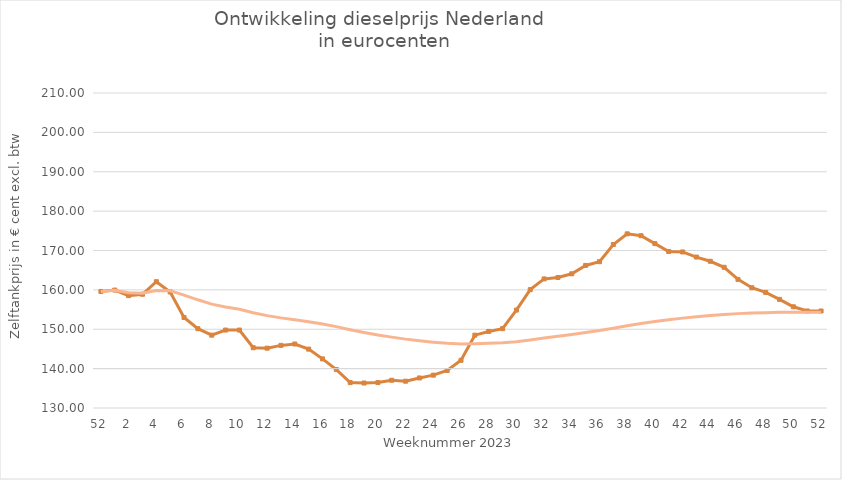
| Category | 52 |
|---|---|
| 52.0 | 159.6 |
| 1.0 | 159.908 |
| 2.0 | 159.266 |
| 3.0 | 159.145 |
| 4.0 | 159.852 |
| 5.0 | 159.779 |
| 6.0 | 158.673 |
| 7.0 | 157.479 |
| 8.0 | 156.376 |
| 9.0 | 155.657 |
| 10.0 | 155.079 |
| 11.0 | 154.202 |
| 12.0 | 153.46 |
| 13.0 | 152.885 |
| 14.0 | 152.416 |
| 15.0 | 151.923 |
| 16.0 | 151.338 |
| 17.0 | 150.663 |
| 18.0 | 149.88 |
| 19.0 | 149.172 |
| 20.0 | 148.541 |
| 21.0 | 147.997 |
| 22.0 | 147.492 |
| 23.0 | 147.066 |
| 24.0 | 146.705 |
| 25.0 | 146.419 |
| 26.0 | 146.255 |
| 27.0 | 146.337 |
| 28.0 | 146.448 |
| 29.0 | 146.575 |
| 30.0 | 146.85 |
| 31.0 | 147.274 |
| 32.0 | 147.757 |
| 33.0 | 148.221 |
| 34.0 | 148.686 |
| 35.0 | 149.184 |
| 36.0 | 149.681 |
| 37.0 | 150.269 |
| 38.0 | 150.898 |
| 39.0 | 151.482 |
| 40.0 | 151.987 |
| 41.0 | 152.418 |
| 42.0 | 152.827 |
| 43.0 | 153.186 |
| 44.0 | 153.505 |
| 45.0 | 153.776 |
| 46.0 | 153.969 |
| 47.0 | 154.108 |
| 48.0 | 154.217 |
| 49.0 | 154.286 |
| 50.0 | 154.314 |
| 51.0 | 154.321 |
| 52.0 | 154.327 |